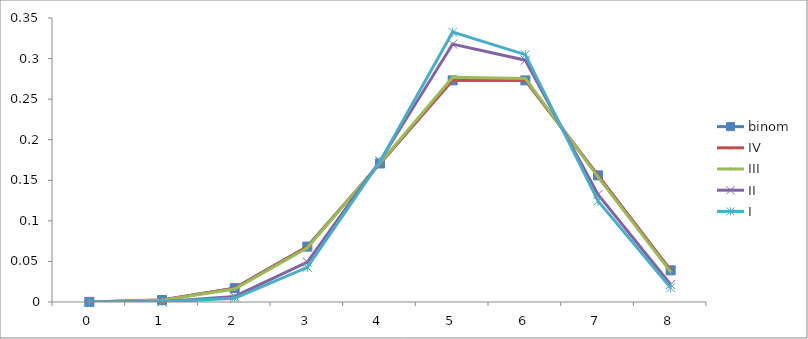
| Category | binom | IV | III | II | I |
|---|---|---|---|---|---|
| 0.0 | 0 | 0 | 0 | 0 | 0 |
| 1.0 | 0.002 | 0.002 | 0.002 | 0 | 0 |
| 2.0 | 0.017 | 0.017 | 0.016 | 0.007 | 0.005 |
| 3.0 | 0.068 | 0.068 | 0.067 | 0.049 | 0.043 |
| 4.0 | 0.171 | 0.171 | 0.171 | 0.174 | 0.173 |
| 5.0 | 0.273 | 0.273 | 0.277 | 0.318 | 0.333 |
| 6.0 | 0.273 | 0.273 | 0.275 | 0.298 | 0.305 |
| 7.0 | 0.156 | 0.156 | 0.154 | 0.132 | 0.124 |
| 8.0 | 0.039 | 0.039 | 0.037 | 0.022 | 0.017 |